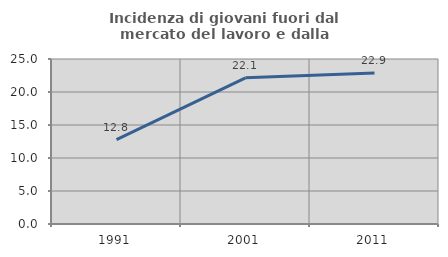
| Category | Incidenza di giovani fuori dal mercato del lavoro e dalla formazione  |
|---|---|
| 1991.0 | 12.793 |
| 2001.0 | 22.147 |
| 2011.0 | 22.87 |